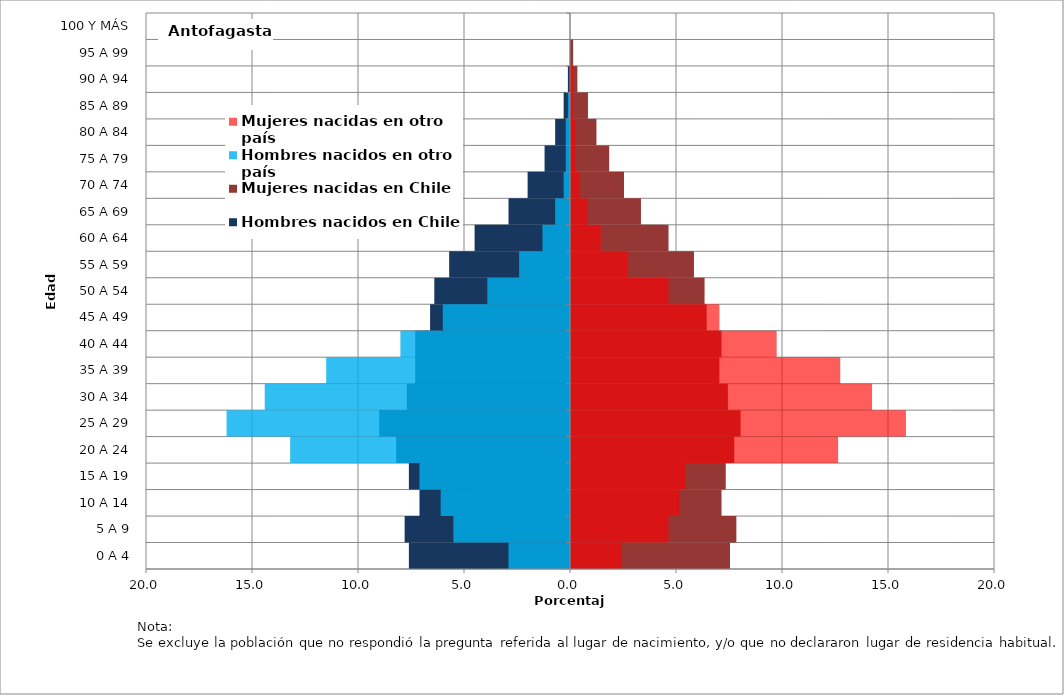
| Category | Hombres nacidos en Chile | Mujeres nacidas en Chile | Hombres nacidos en otro país | Mujeres nacidas en otro país |
|---|---|---|---|---|
| 0 A 4 | -7.6 | 7.5 | -2.9 | 2.4 |
| 5 A 9 | -7.8 | 7.8 | -5.5 | 4.6 |
| 10 A 14 | -7.1 | 7.1 | -6.1 | 5.1 |
| 15 A 19 | -7.6 | 7.3 | -7.1 | 5.4 |
| 20 A 24 | -8.2 | 7.7 | -13.2 | 12.6 |
| 25 A 29 | -9 | 8 | -16.2 | 15.8 |
| 30 A 34 | -7.7 | 7.4 | -14.4 | 14.2 |
| 35 A 39 | -7.3 | 7 | -11.5 | 12.7 |
| 40 A 44 | -7.3 | 7.1 | -8 | 9.7 |
| 45 A 49 | -6.6 | 6.4 | -6 | 7 |
| 50 A 54 | -6.4 | 6.3 | -3.9 | 4.6 |
| 55 A 59 | -5.7 | 5.8 | -2.4 | 2.7 |
| 60 A 64 | -4.5 | 4.6 | -1.3 | 1.4 |
| 65 A 69 | -2.9 | 3.3 | -0.7 | 0.8 |
| 70 A 74 | -2 | 2.5 | -0.3 | 0.4 |
| 75 A 79 | -1.2 | 1.8 | -0.2 | 0.2 |
| 80 A 84 | -0.7 | 1.2 | -0.2 | 0.2 |
| 85 A 89 | -0.3 | 0.8 | -0.1 | 0.1 |
| 90 A 94 | -0.1 | 0.3 | 0 | 0.1 |
| 95 A 99 | 0 | 0.1 | 0 | 0 |
| 100 Y MÁS | 0 | 0 | 0 | 0 |